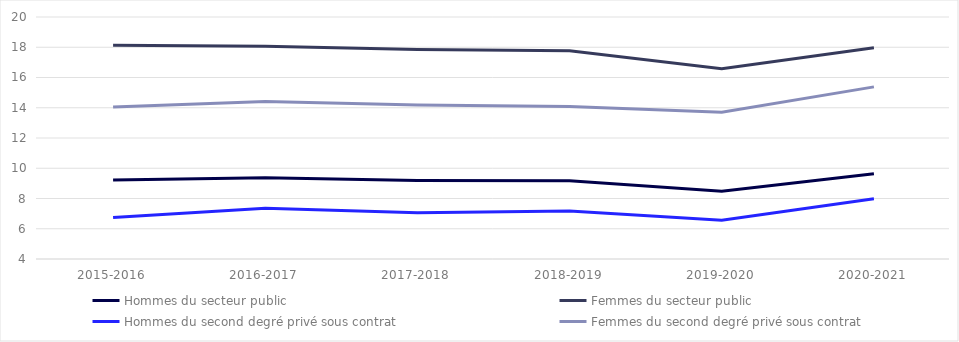
| Category | Hommes du secteur public | Femmes du secteur public | Hommes du second degré privé sous contrat | Femmes du second degré privé sous contrat |
|---|---|---|---|---|
| 2015-2016 | 9.22 | 18.13 | 6.74 | 14.05 |
| 2016-2017 | 9.37 | 18.07 | 7.35 | 14.42 |
| 2017-2018 | 9.19 | 17.85 | 7.06 | 14.18 |
| 2018-2019 | 9.18 | 17.77 | 7.17 | 14.09 |
| 2019-2020 | 8.48 | 16.58 | 6.57 | 13.7 |
| 2020-2021 | 9.64 | 17.96 | 7.99 | 15.38 |